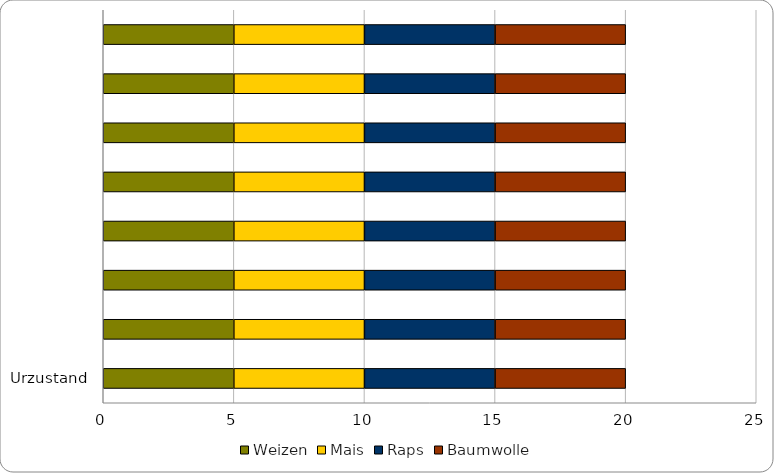
| Category | Weizen | Mais | Raps | Baumwolle |
|---|---|---|---|---|
|  | 5 | 5 | 5 | 5 |
|  | 5 | 5 | 5 | 5 |
|  | 5 | 5 | 5 | 5 |
|  | 5 | 5 | 5 | 5 |
|  | 5 | 5 | 5 | 5 |
|  | 5 | 5 | 5 | 5 |
|  | 5 | 5 | 5 | 5 |
| Urzustand | 5 | 5 | 5 | 5 |